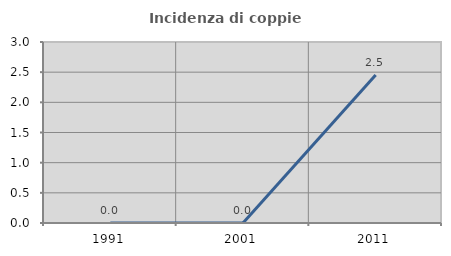
| Category | Incidenza di coppie miste |
|---|---|
| 1991.0 | 0 |
| 2001.0 | 0 |
| 2011.0 | 2.454 |